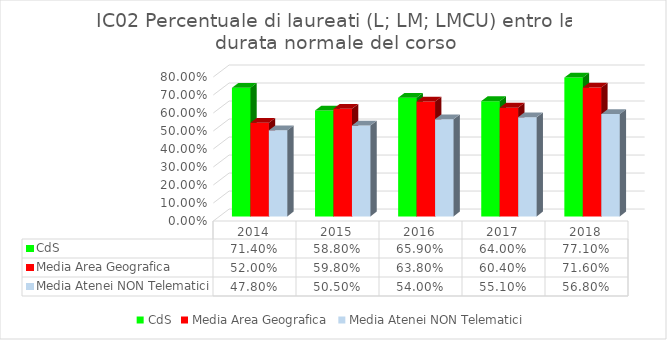
| Category | CdS | Media Area Geografica | Media Atenei NON Telematici |
|---|---|---|---|
| 2014.0 | 0.714 | 0.52 | 0.478 |
| 2015.0 | 0.588 | 0.598 | 0.505 |
| 2016.0 | 0.659 | 0.638 | 0.54 |
| 2017.0 | 0.64 | 0.604 | 0.551 |
| 2018.0 | 0.771 | 0.716 | 0.568 |